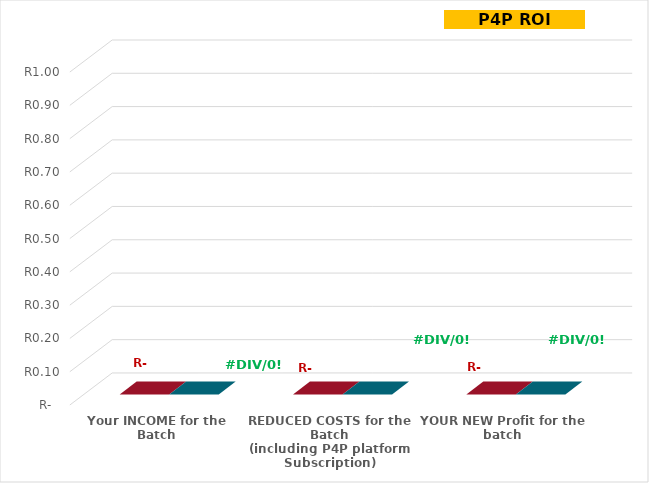
| Category | Current Costs | P4P Savings |
|---|---|---|
| Your INCOME for the Batch | 0 | 0 |
| REDUCED COSTS for the Batch
(including P4P platform Subscription) | 0 | 0 |
| YOUR NEW Profit for the batch | 0 | 0 |